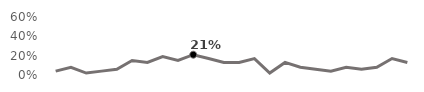
| Category | Friday |
|---|---|
| 1994.0 | 0.04 |
| 1995.0 | 0.08 |
| 1996.0 | 0.02 |
| 1997.0 | 0.04 |
| 1998.0 | 0.06 |
| 1999.0 | 0.15 |
| 2000.0 | 0.13 |
| 2001.0 | 0.19 |
| 2002.0 | 0.15 |
| 2003.0 | 0.21 |
| 2004.0 | 0.17 |
| 2005.0 | 0.13 |
| 2006.0 | 0.13 |
| 2007.0 | 0.17 |
| 2008.0 | 0.02 |
| 2009.0 | 0.13 |
| 2010.0 | 0.08 |
| 2011.0 | 0.06 |
| 2012.0 | 0.04 |
| 2013.0 | 0.08 |
| 2014.0 | 0.06 |
| 2015.0 | 0.08 |
| 2016.0 | 0.17 |
| 2017.0 | 0.13 |